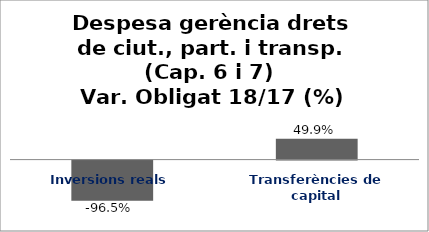
| Category | Series 0 |
|---|---|
| Inversions reals | -0.965 |
| Transferències de capital | 0.499 |